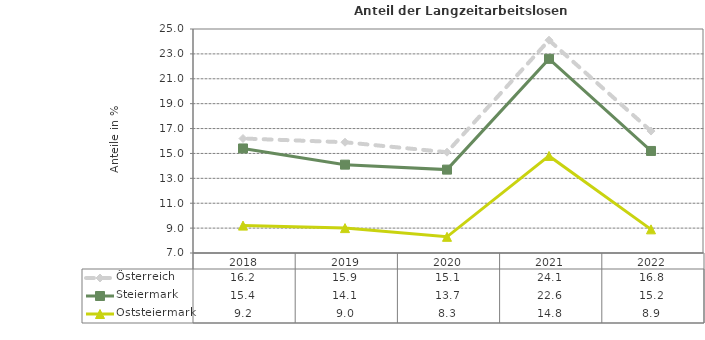
| Category | Österreich | Steiermark | Oststeiermark |
|---|---|---|---|
| 2022.0 | 16.8 | 15.2 | 8.9 |
| 2021.0 | 24.1 | 22.6 | 14.8 |
| 2020.0 | 15.1 | 13.7 | 8.3 |
| 2019.0 | 15.9 | 14.1 | 9 |
| 2018.0 | 16.2 | 15.4 | 9.2 |